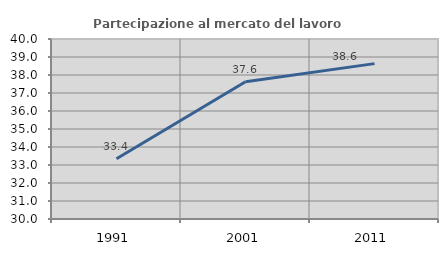
| Category | Partecipazione al mercato del lavoro  femminile |
|---|---|
| 1991.0 | 33.351 |
| 2001.0 | 37.625 |
| 2011.0 | 38.632 |